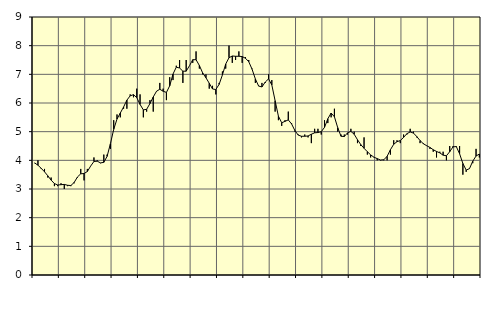
| Category | Piggar | Series 1 |
|---|---|---|
| nan | 3.9 | 3.91 |
| 87.0 | 4 | 3.83 |
| 87.0 | 3.7 | 3.72 |
| 87.0 | 3.7 | 3.6 |
| nan | 3.4 | 3.46 |
| 88.0 | 3.4 | 3.31 |
| 88.0 | 3.1 | 3.19 |
| 88.0 | 3.1 | 3.14 |
| nan | 3.2 | 3.15 |
| 89.0 | 3 | 3.16 |
| 89.0 | 3.1 | 3.13 |
| 89.0 | 3.1 | 3.12 |
| nan | 3.2 | 3.23 |
| 90.0 | 3.4 | 3.42 |
| 90.0 | 3.7 | 3.53 |
| 90.0 | 3.3 | 3.54 |
| nan | 3.7 | 3.61 |
| 91.0 | 3.8 | 3.8 |
| 91.0 | 4.1 | 3.96 |
| 91.0 | 4 | 3.97 |
| nan | 3.9 | 3.91 |
| 92.0 | 4.2 | 3.93 |
| 92.0 | 4.2 | 4.14 |
| 92.0 | 4.4 | 4.58 |
| nan | 5.4 | 5.08 |
| 93.0 | 5.6 | 5.44 |
| 93.0 | 5.5 | 5.65 |
| 93.0 | 5.8 | 5.86 |
| nan | 5.8 | 6.1 |
| 94.0 | 6.3 | 6.25 |
| 94.0 | 6.2 | 6.29 |
| 94.0 | 6.5 | 6.19 |
| nan | 6.3 | 5.95 |
| 95.0 | 5.5 | 5.76 |
| 95.0 | 5.7 | 5.78 |
| 95.0 | 6.1 | 5.98 |
| nan | 5.7 | 6.21 |
| 96.0 | 6.4 | 6.41 |
| 96.0 | 6.7 | 6.48 |
| 96.0 | 6.5 | 6.41 |
| nan | 6.1 | 6.37 |
| 97.0 | 6.9 | 6.6 |
| 97.0 | 6.8 | 7.01 |
| 97.0 | 7.3 | 7.25 |
| nan | 7.5 | 7.22 |
| 98.0 | 6.7 | 7.11 |
| 98.0 | 7.5 | 7.11 |
| 98.0 | 7.3 | 7.3 |
| nan | 7.4 | 7.51 |
| 99.0 | 7.8 | 7.51 |
| 99.0 | 7.2 | 7.31 |
| 99.0 | 7 | 7.05 |
| nan | 7 | 6.88 |
| 0.0 | 6.5 | 6.69 |
| 0.0 | 6.6 | 6.49 |
| 0.0 | 6.3 | 6.47 |
| nan | 6.7 | 6.65 |
| 1.0 | 7.1 | 6.98 |
| 1.0 | 7.2 | 7.36 |
| 1.0 | 8 | 7.58 |
| nan | 7.4 | 7.64 |
| 2.0 | 7.5 | 7.63 |
| 2.0 | 7.8 | 7.63 |
| 2.0 | 7.4 | 7.62 |
| nan | 7.6 | 7.56 |
| 3.0 | 7.5 | 7.44 |
| 3.0 | 7.2 | 7.18 |
| 3.0 | 6.7 | 6.84 |
| nan | 6.6 | 6.59 |
| 4.0 | 6.7 | 6.56 |
| 4.0 | 6.7 | 6.73 |
| 4.0 | 7 | 6.84 |
| nan | 6.8 | 6.63 |
| 5.0 | 5.7 | 6.08 |
| 5.0 | 5.4 | 5.54 |
| 5.0 | 5.2 | 5.31 |
| nan | 5.4 | 5.36 |
| 6.0 | 5.7 | 5.41 |
| 6.0 | 5.3 | 5.27 |
| 6.0 | 5 | 5.04 |
| nan | 4.9 | 4.88 |
| 7.0 | 4.8 | 4.84 |
| 7.0 | 4.9 | 4.84 |
| 7.0 | 4.8 | 4.85 |
| nan | 4.6 | 4.91 |
| 8.0 | 5.1 | 4.96 |
| 8.0 | 5.1 | 4.97 |
| 8.0 | 4.9 | 5 |
| nan | 5.4 | 5.15 |
| 9.0 | 5.3 | 5.45 |
| 9.0 | 5.5 | 5.65 |
| 9.0 | 5.8 | 5.52 |
| nan | 5 | 5.14 |
| 10.0 | 4.9 | 4.84 |
| 10.0 | 4.9 | 4.83 |
| 10.0 | 4.9 | 4.96 |
| nan | 5.1 | 5.01 |
| 11.0 | 5 | 4.91 |
| 11.0 | 4.6 | 4.72 |
| 11.0 | 4.5 | 4.55 |
| nan | 4.8 | 4.42 |
| 12.0 | 4.2 | 4.3 |
| 12.0 | 4.1 | 4.19 |
| 12.0 | 4.1 | 4.11 |
| nan | 4 | 4.06 |
| 13.0 | 4 | 4.01 |
| 13.0 | 4 | 4.02 |
| 13.0 | 4 | 4.14 |
| nan | 4.2 | 4.37 |
| 14.0 | 4.7 | 4.56 |
| 14.0 | 4.7 | 4.65 |
| 14.0 | 4.6 | 4.69 |
| nan | 4.9 | 4.8 |
| 15.0 | 4.9 | 4.93 |
| 15.0 | 5.1 | 4.99 |
| 15.0 | 5 | 4.95 |
| nan | 4.8 | 4.83 |
| 16.0 | 4.6 | 4.69 |
| 16.0 | 4.6 | 4.58 |
| 16.0 | 4.5 | 4.51 |
| nan | 4.4 | 4.45 |
| 17.0 | 4.3 | 4.37 |
| 17.0 | 4.1 | 4.31 |
| 17.0 | 4.3 | 4.26 |
| nan | 4.3 | 4.18 |
| 18.0 | 4 | 4.16 |
| 18.0 | 4.5 | 4.3 |
| 18.0 | 4.5 | 4.47 |
| nan | 4.5 | 4.48 |
| 19.0 | 4.5 | 4.23 |
| 19.0 | 3.5 | 3.89 |
| 19.0 | 3.6 | 3.66 |
| nan | 3.7 | 3.71 |
| 20.0 | 3.9 | 3.97 |
| 20.0 | 4.4 | 4.15 |
| 20.0 | 4.1 | 4.22 |